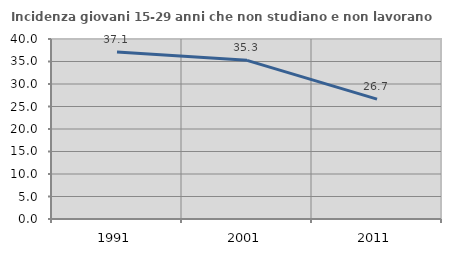
| Category | Incidenza giovani 15-29 anni che non studiano e non lavorano  |
|---|---|
| 1991.0 | 37.117 |
| 2001.0 | 35.255 |
| 2011.0 | 26.653 |